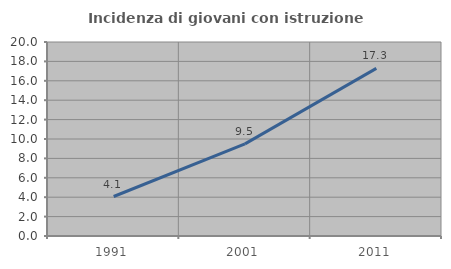
| Category | Incidenza di giovani con istruzione universitaria |
|---|---|
| 1991.0 | 4.071 |
| 2001.0 | 9.499 |
| 2011.0 | 17.282 |